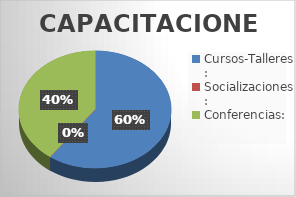
| Category | Series 0 |
|---|---|
| Cursos-Talleres: | 3 |
| Socializaciones: | 0 |
| Conferencias: | 2 |